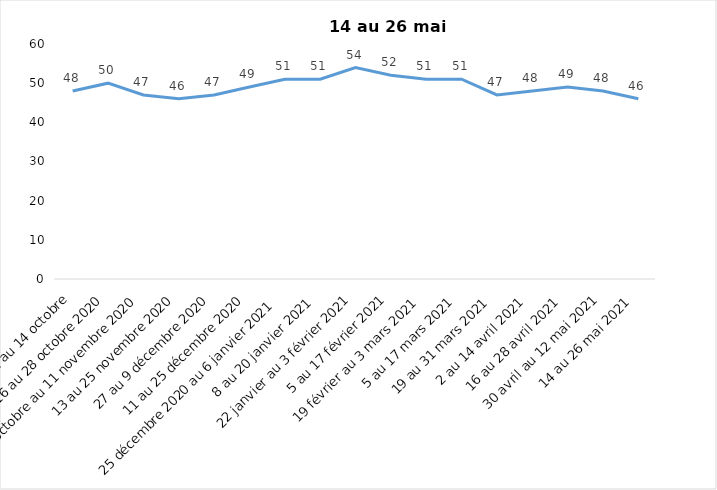
| Category | Toujours aux trois mesures |
|---|---|
| 2 au 14 octobre | 48 |
| 16 au 28 octobre 2020 | 50 |
| 30 octobre au 11 novembre 2020 | 47 |
| 13 au 25 novembre 2020 | 46 |
| 27 au 9 décembre 2020 | 47 |
| 11 au 25 décembre 2020 | 49 |
| 25 décembre 2020 au 6 janvier 2021 | 51 |
| 8 au 20 janvier 2021 | 51 |
| 22 janvier au 3 février 2021 | 54 |
| 5 au 17 février 2021 | 52 |
| 19 février au 3 mars 2021 | 51 |
| 5 au 17 mars 2021 | 51 |
| 19 au 31 mars 2021 | 47 |
| 2 au 14 avril 2021 | 48 |
| 16 au 28 avril 2021 | 49 |
| 30 avril au 12 mai 2021 | 48 |
| 14 au 26 mai 2021 | 46 |